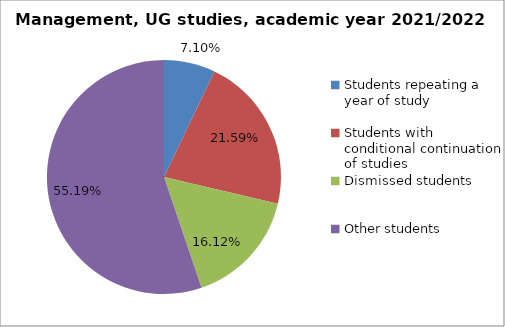
| Category | Series 0 |
|---|---|
| Students repeating a year of study | 26 |
| Students with conditional continuation of studies | 79 |
| Dismissed students | 59 |
| Other students | 202 |